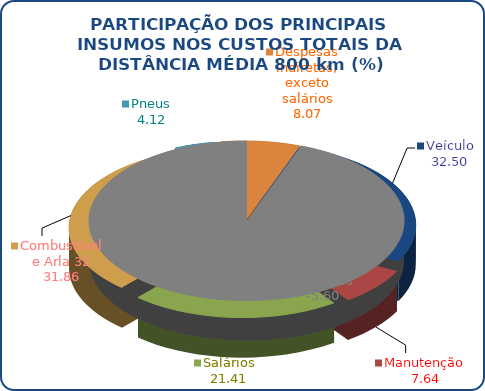
| Category | Series 0 |
|---|---|
| Veículo | 32.504 |
| Manutenção | 7.643 |
| Salários | 21.406 |
| Combustível e Arla 32 | 31.858 |
| Pneus | 4.125 |
| Despesas indiretas, exceto salários | 8.066 |
| Créditos de impostos | -5.6 |